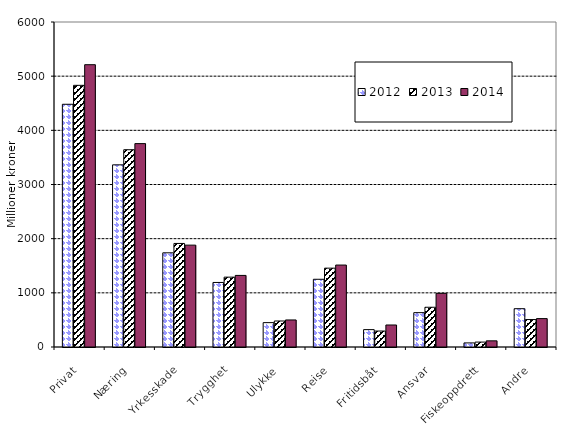
| Category | 2012 | 2013 | 2014 |
|---|---|---|---|
| Privat | 4481.193 | 4830.734 | 5211.684 |
| Næring | 3362.859 | 3642.079 | 3754.691 |
| Yrkesskade | 1738.827 | 1911.742 | 1880.638 |
| Trygghet | 1191.406 | 1289.461 | 1321.528 |
| Ulykke | 449.809 | 480.161 | 499.202 |
| Reise | 1250.346 | 1455.682 | 1512.762 |
| Fritidsbåt | 320.794 | 294.694 | 406.254 |
| Ansvar | 634.225 | 733.659 | 990.363 |
| Fiskeoppdrett | 75.303 | 90.619 | 113.816 |
| Andre | 707.262 | 507.031 | 524.325 |